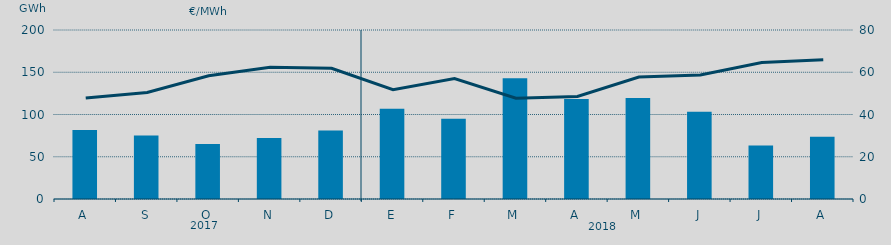
| Category | Energía a subir |
|---|---|
| A | 81.536 |
| S | 75.102 |
| O | 65.09 |
| N | 72.29 |
| D | 81.05 |
| E | 106.847 |
| F | 95.118 |
| M | 142.766 |
| A | 118.38 |
| M | 119.519 |
| J | 103.392 |
| J | 63.222 |
| A | 73.63 |